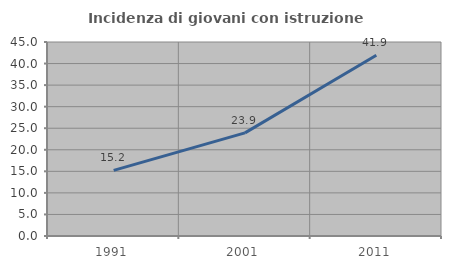
| Category | Incidenza di giovani con istruzione universitaria |
|---|---|
| 1991.0 | 15.217 |
| 2001.0 | 23.913 |
| 2011.0 | 41.935 |